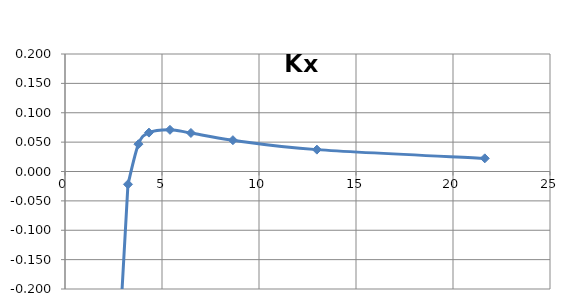
| Category | Series 0 |
|---|---|
| 2.704875 | -0.34 |
| 3.24585 | -0.022 |
| 3.786825 | 0.047 |
| 4.3278 | 0.066 |
| 5.40975 | 0.071 |
| 6.4917 | 0.066 |
| 8.6556 | 0.053 |
| 12.9834 | 0.037 |
| 21.639 | 0.022 |